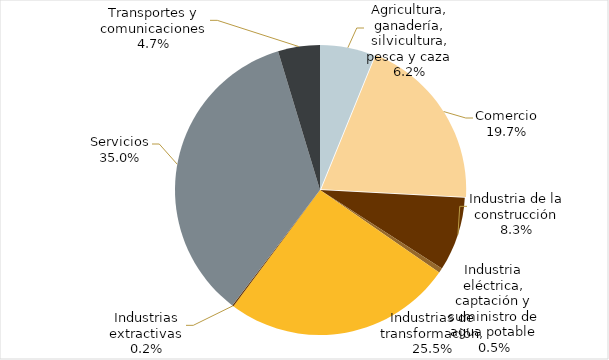
| Category | Series 0 |
|---|---|
| Agricultura, ganadería, silvicultura, pesca y caza | 0.062 |
| Comercio | 0.197 |
| Industria de la construcción | 0.083 |
| Industria eléctrica, captación y suministro de agua potable | 0.005 |
| Industrias de transformación | 0.255 |
| Industrias extractivas | 0.002 |
| Servicios | 0.35 |
| Transportes y comunicaciones | 0.047 |